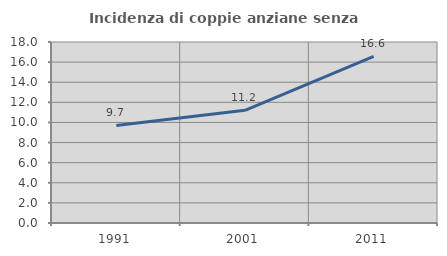
| Category | Incidenza di coppie anziane senza figli  |
|---|---|
| 1991.0 | 9.696 |
| 2001.0 | 11.204 |
| 2011.0 | 16.58 |